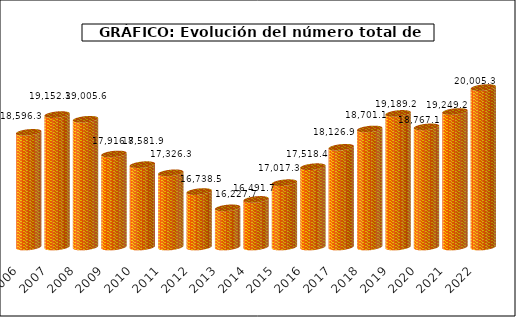
| Category | Series1 |
|---|---|
| 2006.0 | 18596.3 |
| 2007.0 | 19152.3 |
| 2008.0 | 19005.6 |
| 2009.0 | 17916.8 |
| 2010.0 | 17581.9 |
| 2011.0 | 17326.3 |
| 2012.0 | 16738.5 |
| 2013.0 | 16227.7 |
| 2014.0 | 16491.7 |
| 2015.0 | 17017.3 |
| 2016.0 | 17518.4 |
| 2017.0 | 18126.9 |
| 2018.0 | 18701.1 |
| 2019.0 | 19189.213 |
| 2020.0 | 18767.144 |
| 2021.0 | 19249.223 |
| 2022.0 | 20005.3 |